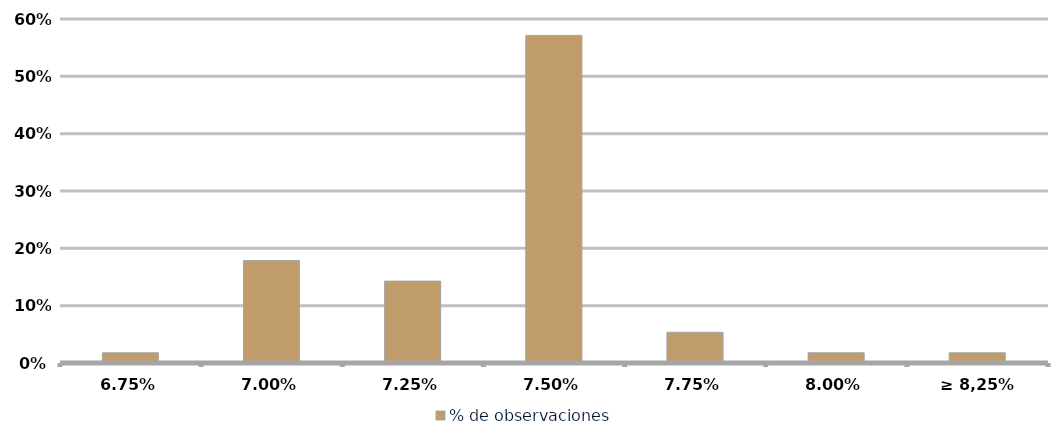
| Category | % de observaciones  |
|---|---|
| 6,75% | 0.018 |
| 7,00% | 0.179 |
| 7,25% | 0.143 |
| 7,50% | 0.571 |
| 7,75% | 0.054 |
| 8,00% | 0.018 |
| ≥ 8,25% | 0.018 |